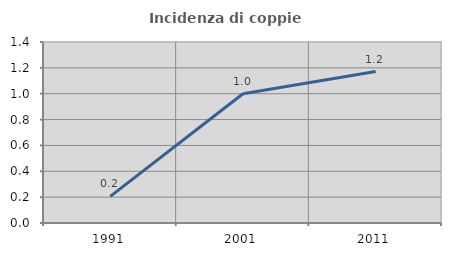
| Category | Incidenza di coppie miste |
|---|---|
| 1991.0 | 0.206 |
| 2001.0 | 1 |
| 2011.0 | 1.171 |